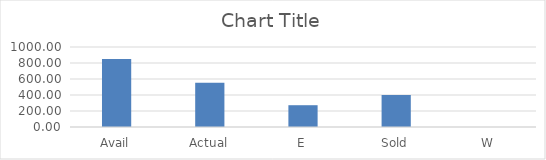
| Category | Series 0 |
|---|---|
| Avail | 849.7 |
| Actual | 553.53 |
| E | 272.37 |
| Sold | 401.35 |
| W | 0 |